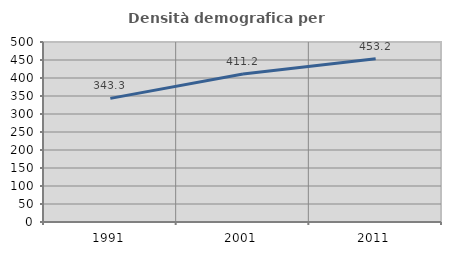
| Category | Densità demografica |
|---|---|
| 1991.0 | 343.345 |
| 2001.0 | 411.163 |
| 2011.0 | 453.162 |